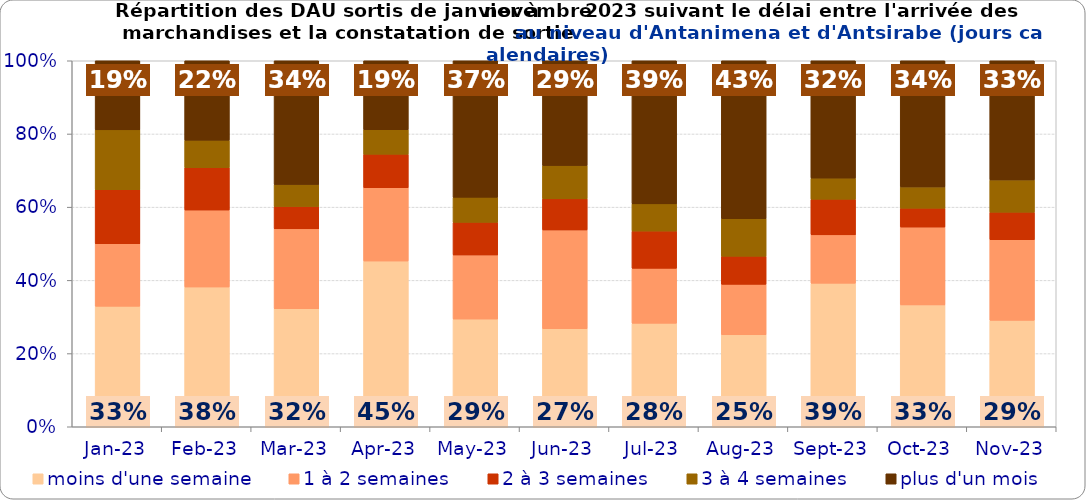
| Category | moins d'une semaine | 1 à 2 semaines | 2 à 3 semaines | 3 à 4 semaines | plus d'un mois |
|---|---|---|---|---|---|
| 2023-01-01 | 0.329 | 0.171 | 0.148 | 0.164 | 0.189 |
| 2023-02-01 | 0.382 | 0.21 | 0.116 | 0.075 | 0.217 |
| 2023-03-01 | 0.322 | 0.218 | 0.061 | 0.06 | 0.338 |
| 2023-04-01 | 0.453 | 0.2 | 0.092 | 0.067 | 0.188 |
| 2023-05-01 | 0.294 | 0.175 | 0.089 | 0.069 | 0.373 |
| 2023-06-01 | 0.268 | 0.27 | 0.085 | 0.091 | 0.286 |
| 2023-07-01 | 0.283 | 0.15 | 0.102 | 0.074 | 0.391 |
| 2023-08-01 | 0.251 | 0.138 | 0.077 | 0.102 | 0.432 |
| 2023-09-01 | 0.392 | 0.132 | 0.097 | 0.058 | 0.321 |
| 2023-10-01 | 0.333 | 0.213 | 0.052 | 0.058 | 0.345 |
| 2023-11-01 | 0.291 | 0.22 | 0.075 | 0.088 | 0.326 |